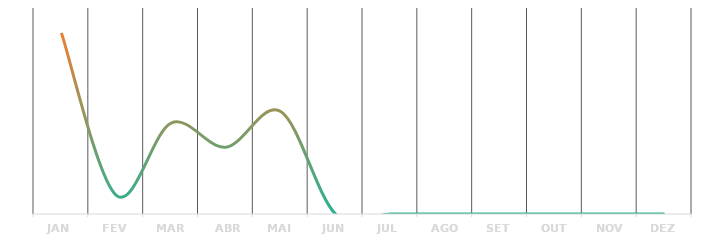
| Category | Series 0 |
|---|---|
| JAN | 1231 |
| FEV | 127 |
| MAR | 618 |
| ABR | 454 |
| MAI | 696 |
| JUN | 0 |
| JUL | 0 |
| AGO | 0 |
| SET | 0 |
| OUT | 0 |
| NOV | 0 |
| DEZ | 0 |